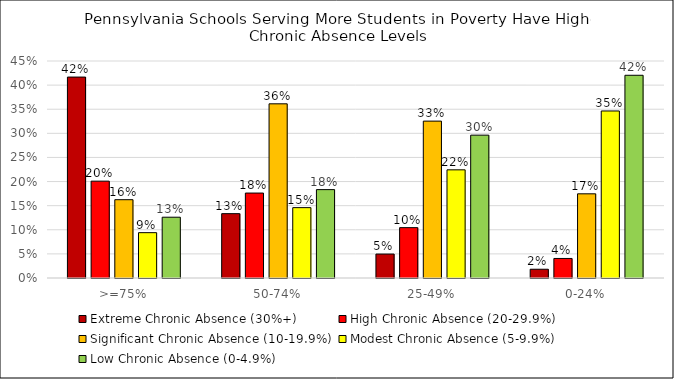
| Category | Extreme Chronic Absence (30%+) | High Chronic Absence (20-29.9%) | Significant Chronic Absence (10-19.9%) | Modest Chronic Absence (5-9.9%) | Low Chronic Absence (0-4.9%) |
|---|---|---|---|---|---|
| >=75% | 0.417 | 0.201 | 0.162 | 0.094 | 0.126 |
| 50-74% | 0.133 | 0.176 | 0.361 | 0.146 | 0.183 |
| 25-49% | 0.05 | 0.104 | 0.325 | 0.224 | 0.296 |
| 0-24% | 0.018 | 0.041 | 0.175 | 0.346 | 0.42 |